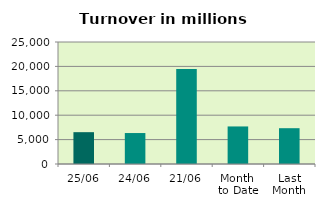
| Category | Series 0 |
|---|---|
| 25/06 | 6522.069 |
| 24/06 | 6344.708 |
| 21/06 | 19479.684 |
| Month 
to Date | 7695.715 |
| Last
Month | 7336.2 |